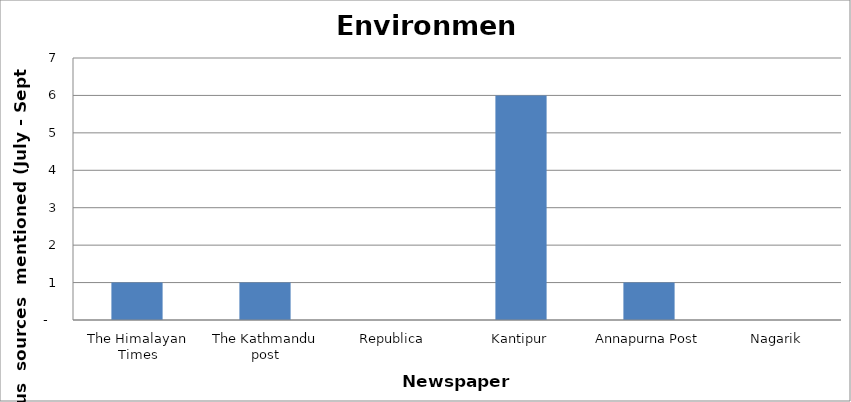
| Category | Environment |
|---|---|
| The Himalayan Times | 1 |
| The Kathmandu post | 1 |
| Republica | 0 |
| Kantipur | 6 |
| Annapurna Post | 1 |
| Nagarik | 0 |